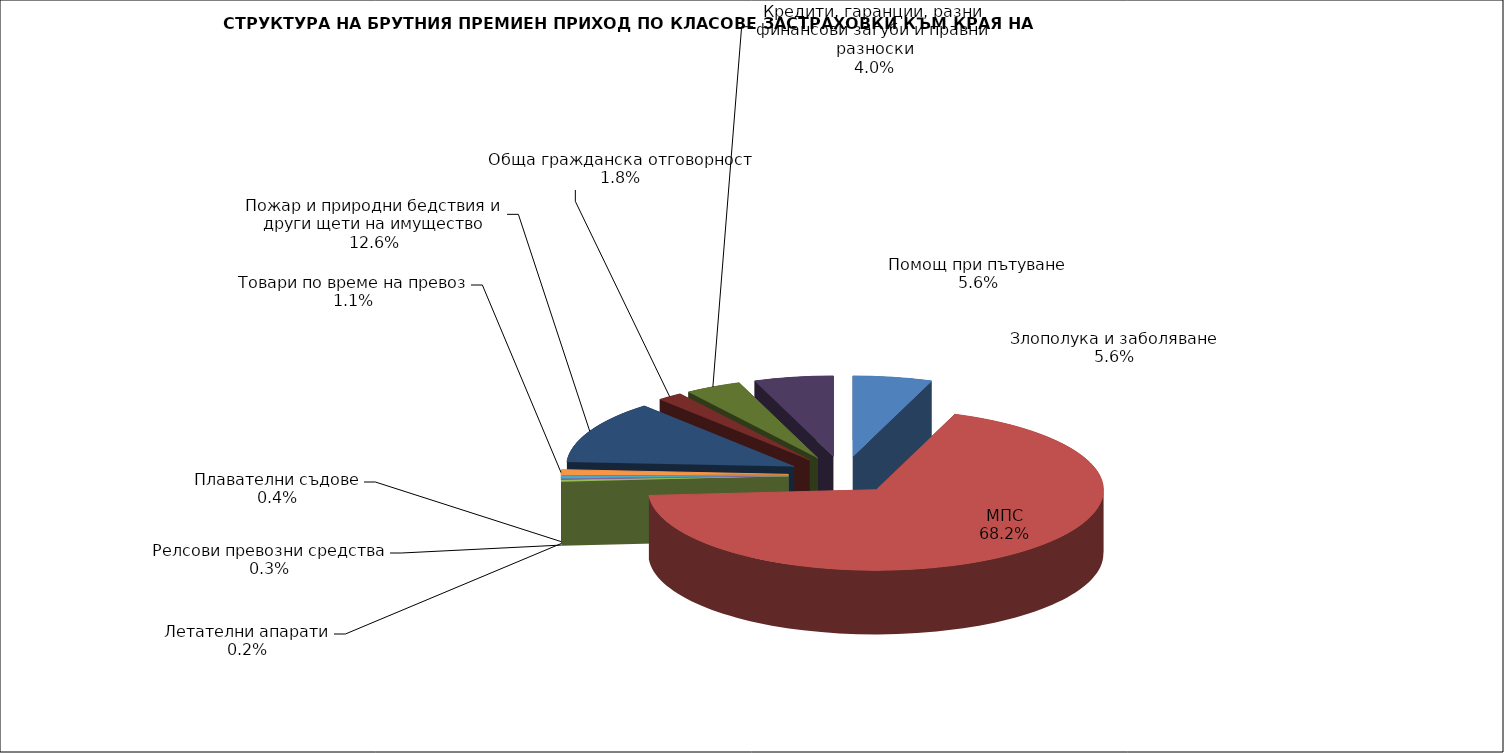
| Category | Злополука и заболяване |
|---|---|
| Злополука и заболяване | 0.056 |
| МПС | 0.682 |
| Релсови превозни средства | 0.003 |
| Летателни апарати | 0.002 |
| Плавателни съдове | 0.004 |
| Товари по време на превоз | 0.011 |
| Пожар и природни бедствия и други щети на имущество | 0.126 |
| Обща гражданска отговорност | 0.018 |
| Кредити, гаранции, разни финансови загуби и правни разноски | 0.04 |
| Помощ при пътуване | 0.056 |